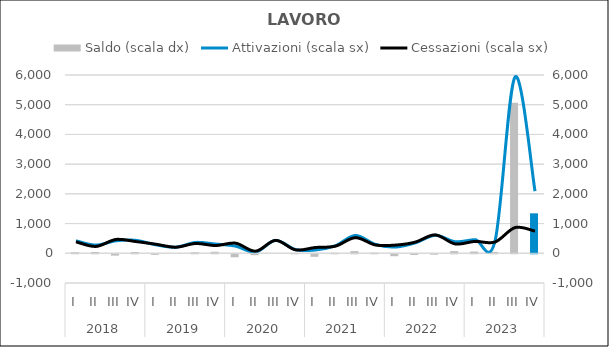
| Category | Saldo (scala dx) |
|---|---|
| 0 | 35 |
| 1 | 45 |
| 2 | -45 |
| 3 | 40 |
| 4 | -20 |
| 5 | 0 |
| 6 | 35 |
| 7 | 50 |
| 8 | -100 |
| 9 | -30 |
| 10 | 0 |
| 11 | 10 |
| 12 | -85 |
| 13 | 15 |
| 14 | 75 |
| 15 | 20 |
| 16 | -65 |
| 17 | -25 |
| 18 | -15 |
| 19 | 75 |
| 20 | 60 |
| 21 | 45 |
| 22 | 5070 |
| 23 | 1345 |